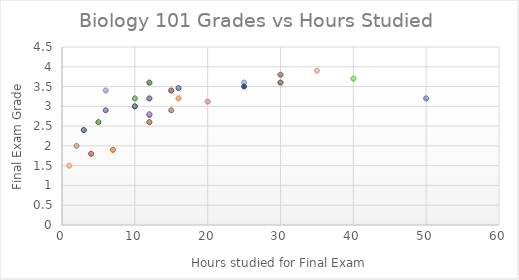
| Category | GPA |
|---|---|
| 16.0 | 3.46 |
| 12.0 | 2.78 |
| 10.0 | 3.2 |
| 12.0 | 2.8 |
| 16.0 | 3.2 |
| 15.0 | 2.9 |
| 10.0 | 3 |
| 15.0 | 3.4 |
| 12.0 | 3.6 |
| 12.0 | 3.2 |
| 12.0 | 2.6 |
| 30.0 | 3.6 |
| 50.0 | 3.2 |
| 20.0 | 3.12 |
| 40.0 | 3.7 |
| 6.0 | 3.4 |
| 1.0 | 1.5 |
| 2.0 | 2 |
| 3.0 | 2.4 |
| 4.0 | 1.8 |
| 5.0 | 2.6 |
| 6.0 | 2.9 |
| 7.0 | 1.9 |
| 30.0 | 3.8 |
| 25.0 | 3.6 |
| 35.0 | 3.9 |
| 25.0 | 3.5 |